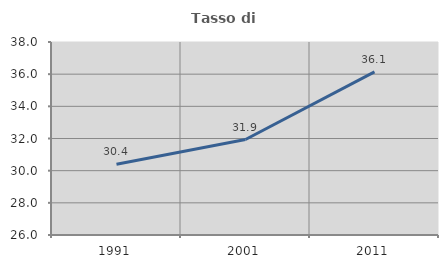
| Category | Tasso di occupazione   |
|---|---|
| 1991.0 | 30.405 |
| 2001.0 | 31.935 |
| 2011.0 | 36.143 |